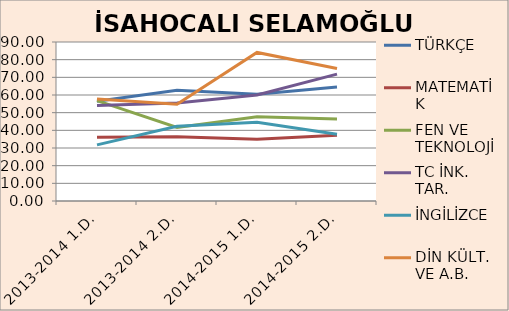
| Category | TÜRKÇE | MATEMATİK | FEN VE TEKNOLOJİ | TC İNK. TAR. | İNGİLİZCE | DİN KÜLT. VE A.B. |
|---|---|---|---|---|---|---|
| 2013-2014 1.D. | 56.5 | 36.11 | 56.84 | 54 | 31.75 | 57.75 |
| 2013-2014 2.D. | 62.62 | 36.43 | 41.67 | 55.48 | 42.25 | 54.76 |
| 2014-2015 1.D. | 60.45 | 35 | 47.73 | 60 | 44.55 | 84.09 |
| 2014-2015 2.D. | 64.55 | 37.27 | 46.36 | 71.82 | 37.73 | 75 |